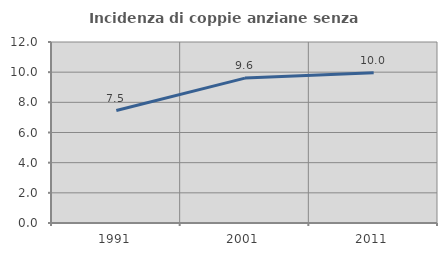
| Category | Incidenza di coppie anziane senza figli  |
|---|---|
| 1991.0 | 7.457 |
| 2001.0 | 9.605 |
| 2011.0 | 9.961 |